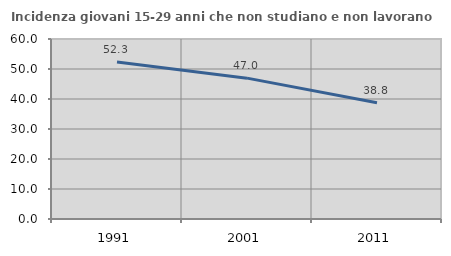
| Category | Incidenza giovani 15-29 anni che non studiano e non lavorano  |
|---|---|
| 1991.0 | 52.345 |
| 2001.0 | 46.952 |
| 2011.0 | 38.776 |